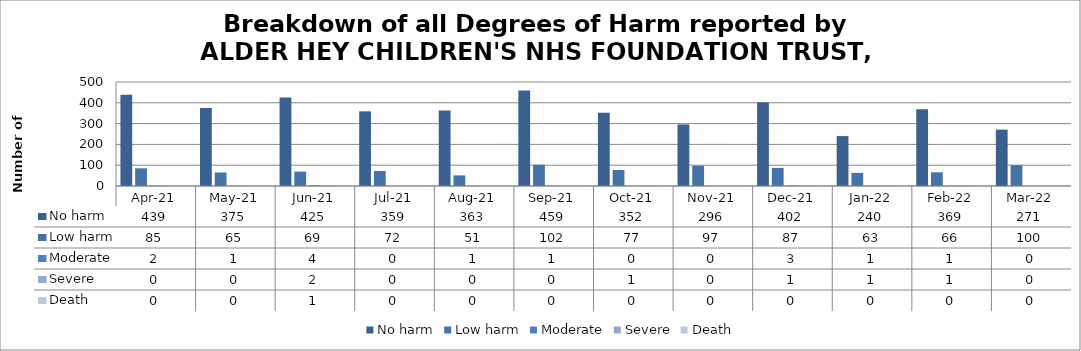
| Category | No harm | Low harm | Moderate | Severe | Death |
|---|---|---|---|---|---|
| Apr-21 | 439 | 85 | 2 | 0 | 0 |
| May-21 | 375 | 65 | 1 | 0 | 0 |
| Jun-21 | 425 | 69 | 4 | 2 | 1 |
| Jul-21 | 359 | 72 | 0 | 0 | 0 |
| Aug-21 | 363 | 51 | 1 | 0 | 0 |
| Sep-21 | 459 | 102 | 1 | 0 | 0 |
| Oct-21 | 352 | 77 | 0 | 1 | 0 |
| Nov-21 | 296 | 97 | 0 | 0 | 0 |
| Dec-21 | 402 | 87 | 3 | 1 | 0 |
| Jan-22 | 240 | 63 | 1 | 1 | 0 |
| Feb-22 | 369 | 66 | 1 | 1 | 0 |
| Mar-22 | 271 | 100 | 0 | 0 | 0 |